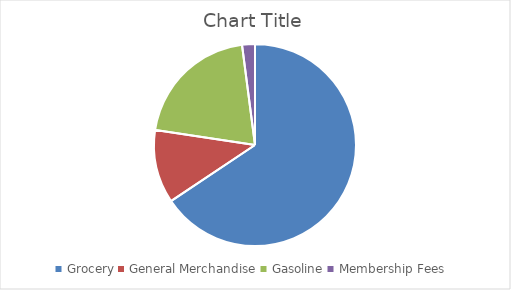
| Category | Series 0 |
|---|---|
| Grocery | 12675351.45 |
| General Merchandise | 2270212.2 |
| Gasoline | 3972871.35 |
| Membership Fees | 396730 |